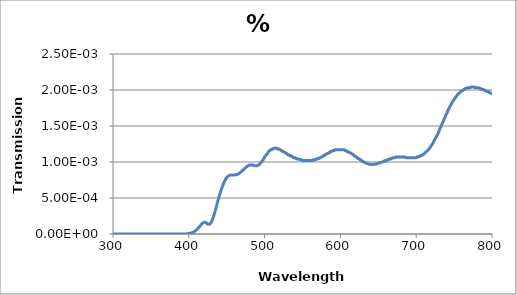
| Category | % Transmission |
|---|---|
| 200.0 | 0 |
| 201.0 | 0 |
| 202.0 | 0 |
| 203.0 | 0 |
| 204.0 | 0 |
| 205.0 | 0 |
| 206.0 | 0 |
| 207.0 | 0 |
| 208.0 | 0 |
| 209.0 | 0 |
| 210.0 | 0 |
| 211.0 | 0 |
| 212.0 | 0 |
| 213.0 | 0 |
| 214.0 | 0 |
| 215.0 | 0 |
| 216.0 | 0 |
| 217.0 | 0 |
| 218.0 | 0 |
| 219.0 | 0 |
| 220.0 | 0 |
| 221.0 | 0 |
| 222.0 | 0 |
| 223.0 | 0 |
| 224.0 | 0 |
| 225.0 | 0 |
| 226.0 | 0 |
| 227.0 | 0 |
| 228.0 | 0 |
| 229.0 | 0 |
| 230.0 | 0 |
| 231.0 | 0 |
| 232.0 | 0 |
| 233.0 | 0 |
| 234.0 | 0 |
| 235.0 | 0 |
| 236.0 | 0 |
| 237.0 | 0 |
| 238.0 | 0 |
| 239.0 | 0 |
| 240.0 | 0 |
| 241.0 | 0 |
| 242.0 | 0 |
| 243.0 | 0 |
| 244.0 | 0 |
| 245.0 | 0 |
| 246.0 | 0 |
| 247.0 | 0 |
| 248.0 | 0 |
| 249.0 | 0 |
| 250.0 | 0 |
| 251.0 | 0 |
| 252.0 | 0 |
| 253.0 | 0 |
| 254.0 | 0 |
| 255.0 | 0 |
| 256.0 | 0 |
| 257.0 | 0 |
| 258.0 | 0 |
| 259.0 | 0 |
| 260.0 | 0 |
| 261.0 | 0 |
| 262.0 | 0 |
| 263.0 | 0 |
| 264.0 | 0 |
| 265.0 | 0 |
| 266.0 | 0 |
| 267.0 | 0 |
| 268.0 | 0 |
| 269.0 | 0 |
| 270.0 | 0 |
| 271.0 | 0 |
| 272.0 | 0 |
| 273.0 | 0 |
| 274.0 | 0 |
| 275.0 | 0 |
| 276.0 | 0 |
| 277.0 | 0 |
| 278.0 | 0 |
| 279.0 | 0 |
| 280.0 | 0 |
| 281.0 | 0 |
| 282.0 | 0 |
| 283.0 | 0 |
| 284.0 | 0 |
| 285.0 | 0 |
| 286.0 | 0 |
| 287.0 | 0 |
| 288.0 | 0 |
| 289.0 | 0 |
| 290.0 | 0 |
| 291.0 | 0 |
| 292.0 | 0 |
| 293.0 | 0 |
| 294.0 | 0 |
| 295.0 | 0 |
| 296.0 | 0 |
| 297.0 | 0 |
| 298.0 | 0 |
| 299.0 | 0 |
| 300.0 | 0 |
| 301.0 | 0 |
| 302.0 | 0 |
| 303.0 | 0 |
| 304.0 | 0 |
| 305.0 | 0 |
| 306.0 | 0 |
| 307.0 | 0 |
| 308.0 | 0 |
| 309.0 | 0 |
| 310.0 | 0 |
| 311.0 | 0 |
| 312.0 | 0 |
| 313.0 | 0 |
| 314.0 | 0 |
| 315.0 | 0 |
| 316.0 | 0 |
| 317.0 | 0 |
| 318.0 | 0 |
| 319.0 | 0 |
| 320.0 | 0 |
| 321.0 | 0 |
| 322.0 | 0 |
| 323.0 | 0 |
| 324.0 | 0 |
| 325.0 | 0 |
| 326.0 | 0 |
| 327.0 | 0 |
| 328.0 | 0 |
| 329.0 | 0 |
| 330.0 | 0 |
| 331.0 | 0 |
| 332.0 | 0 |
| 333.0 | 0 |
| 334.0 | 0 |
| 335.0 | 0 |
| 336.0 | 0 |
| 337.0 | 0 |
| 338.0 | 0 |
| 339.0 | 0 |
| 340.0 | 0 |
| 341.0 | 0 |
| 342.0 | 0 |
| 343.0 | 0 |
| 344.0 | 0 |
| 345.0 | 0 |
| 346.0 | 0 |
| 347.0 | 0 |
| 348.0 | 0 |
| 349.0 | 0 |
| 350.0 | 0 |
| 351.0 | 0 |
| 352.0 | 0 |
| 353.0 | 0 |
| 354.0 | 0 |
| 355.0 | 0 |
| 356.0 | 0 |
| 357.0 | 0 |
| 358.0 | 0 |
| 359.0 | 0 |
| 360.0 | 0 |
| 361.0 | 0 |
| 362.0 | 0 |
| 363.0 | 0 |
| 364.0 | 0 |
| 365.0 | 0 |
| 366.0 | 0 |
| 367.0 | 0 |
| 368.0 | 0 |
| 369.0 | 0 |
| 370.0 | 0 |
| 371.0 | 0 |
| 372.0 | 0 |
| 373.0 | 0 |
| 374.0 | 0 |
| 375.0 | 0 |
| 376.0 | 0 |
| 377.0 | 0 |
| 378.0 | 0 |
| 379.0 | 0 |
| 380.0 | 0 |
| 381.0 | 0 |
| 382.0 | 0 |
| 383.0 | 0 |
| 384.0 | 0 |
| 385.0 | 0 |
| 386.0 | 0 |
| 387.0 | 0 |
| 388.0 | 0 |
| 389.0 | 0 |
| 390.0 | 0 |
| 391.0 | 0 |
| 392.0 | 0 |
| 393.0 | 0 |
| 394.0 | 0 |
| 395.0 | 0 |
| 396.0 | 0 |
| 397.0 | 0 |
| 398.0 | 0 |
| 399.0 | 0 |
| 400.0 | 0 |
| 401.0 | 0 |
| 402.0 | 0 |
| 403.0 | 0 |
| 404.0 | 0 |
| 405.0 | 0 |
| 406.0 | 0 |
| 407.0 | 0 |
| 408.0 | 0 |
| 409.0 | 0 |
| 410.0 | 0 |
| 411.0 | 0 |
| 412.0 | 0 |
| 413.0 | 0 |
| 414.0 | 0 |
| 415.0 | 0 |
| 416.0 | 0 |
| 417.0 | 0 |
| 418.0 | 0 |
| 419.0 | 0 |
| 420.0 | 0 |
| 421.0 | 0 |
| 422.0 | 0 |
| 423.0 | 0 |
| 424.0 | 0 |
| 425.0 | 0 |
| 426.0 | 0 |
| 427.0 | 0 |
| 428.0 | 0 |
| 429.0 | 0 |
| 430.0 | 0 |
| 431.0 | 0 |
| 432.0 | 0 |
| 433.0 | 0 |
| 434.0 | 0 |
| 435.0 | 0 |
| 436.0 | 0 |
| 437.0 | 0 |
| 438.0 | 0 |
| 439.0 | 0 |
| 440.0 | 0.001 |
| 441.0 | 0.001 |
| 442.0 | 0.001 |
| 443.0 | 0.001 |
| 444.0 | 0.001 |
| 445.0 | 0.001 |
| 446.0 | 0.001 |
| 447.0 | 0.001 |
| 448.0 | 0.001 |
| 449.0 | 0.001 |
| 450.0 | 0.001 |
| 451.0 | 0.001 |
| 452.0 | 0.001 |
| 453.0 | 0.001 |
| 454.0 | 0.001 |
| 455.0 | 0.001 |
| 456.0 | 0.001 |
| 457.0 | 0.001 |
| 458.0 | 0.001 |
| 459.0 | 0.001 |
| 460.0 | 0.001 |
| 461.0 | 0.001 |
| 462.0 | 0.001 |
| 463.0 | 0.001 |
| 464.0 | 0.001 |
| 465.0 | 0.001 |
| 466.0 | 0.001 |
| 467.0 | 0.001 |
| 468.0 | 0.001 |
| 469.0 | 0.001 |
| 470.0 | 0.001 |
| 471.0 | 0.001 |
| 472.0 | 0.001 |
| 473.0 | 0.001 |
| 474.0 | 0.001 |
| 475.0 | 0.001 |
| 476.0 | 0.001 |
| 477.0 | 0.001 |
| 478.0 | 0.001 |
| 479.0 | 0.001 |
| 480.0 | 0.001 |
| 481.0 | 0.001 |
| 482.0 | 0.001 |
| 483.0 | 0.001 |
| 484.0 | 0.001 |
| 485.0 | 0.001 |
| 486.0 | 0.001 |
| 487.0 | 0.001 |
| 488.0 | 0.001 |
| 489.0 | 0.001 |
| 490.0 | 0.001 |
| 491.0 | 0.001 |
| 492.0 | 0.001 |
| 493.0 | 0.001 |
| 494.0 | 0.001 |
| 495.0 | 0.001 |
| 496.0 | 0.001 |
| 497.0 | 0.001 |
| 498.0 | 0.001 |
| 499.0 | 0.001 |
| 500.0 | 0.001 |
| 501.0 | 0.001 |
| 502.0 | 0.001 |
| 503.0 | 0.001 |
| 504.0 | 0.001 |
| 505.0 | 0.001 |
| 506.0 | 0.001 |
| 507.0 | 0.001 |
| 508.0 | 0.001 |
| 509.0 | 0.001 |
| 510.0 | 0.001 |
| 511.0 | 0.001 |
| 512.0 | 0.001 |
| 513.0 | 0.001 |
| 514.0 | 0.001 |
| 515.0 | 0.001 |
| 516.0 | 0.001 |
| 517.0 | 0.001 |
| 518.0 | 0.001 |
| 519.0 | 0.001 |
| 520.0 | 0.001 |
| 521.0 | 0.001 |
| 522.0 | 0.001 |
| 523.0 | 0.001 |
| 524.0 | 0.001 |
| 525.0 | 0.001 |
| 526.0 | 0.001 |
| 527.0 | 0.001 |
| 528.0 | 0.001 |
| 529.0 | 0.001 |
| 530.0 | 0.001 |
| 531.0 | 0.001 |
| 532.0 | 0.001 |
| 533.0 | 0.001 |
| 534.0 | 0.001 |
| 535.0 | 0.001 |
| 536.0 | 0.001 |
| 537.0 | 0.001 |
| 538.0 | 0.001 |
| 539.0 | 0.001 |
| 540.0 | 0.001 |
| 541.0 | 0.001 |
| 542.0 | 0.001 |
| 543.0 | 0.001 |
| 544.0 | 0.001 |
| 545.0 | 0.001 |
| 546.0 | 0.001 |
| 547.0 | 0.001 |
| 548.0 | 0.001 |
| 549.0 | 0.001 |
| 550.0 | 0.001 |
| 551.0 | 0.001 |
| 552.0 | 0.001 |
| 553.0 | 0.001 |
| 554.0 | 0.001 |
| 555.0 | 0.001 |
| 556.0 | 0.001 |
| 557.0 | 0.001 |
| 558.0 | 0.001 |
| 559.0 | 0.001 |
| 560.0 | 0.001 |
| 561.0 | 0.001 |
| 562.0 | 0.001 |
| 563.0 | 0.001 |
| 564.0 | 0.001 |
| 565.0 | 0.001 |
| 566.0 | 0.001 |
| 567.0 | 0.001 |
| 568.0 | 0.001 |
| 569.0 | 0.001 |
| 570.0 | 0.001 |
| 571.0 | 0.001 |
| 572.0 | 0.001 |
| 573.0 | 0.001 |
| 574.0 | 0.001 |
| 575.0 | 0.001 |
| 576.0 | 0.001 |
| 577.0 | 0.001 |
| 578.0 | 0.001 |
| 579.0 | 0.001 |
| 580.0 | 0.001 |
| 581.0 | 0.001 |
| 582.0 | 0.001 |
| 583.0 | 0.001 |
| 584.0 | 0.001 |
| 585.0 | 0.001 |
| 586.0 | 0.001 |
| 587.0 | 0.001 |
| 588.0 | 0.001 |
| 589.0 | 0.001 |
| 590.0 | 0.001 |
| 591.0 | 0.001 |
| 592.0 | 0.001 |
| 593.0 | 0.001 |
| 594.0 | 0.001 |
| 595.0 | 0.001 |
| 596.0 | 0.001 |
| 597.0 | 0.001 |
| 598.0 | 0.001 |
| 599.0 | 0.001 |
| 600.0 | 0.001 |
| 601.0 | 0.001 |
| 602.0 | 0.001 |
| 603.0 | 0.001 |
| 604.0 | 0.001 |
| 605.0 | 0.001 |
| 606.0 | 0.001 |
| 607.0 | 0.001 |
| 608.0 | 0.001 |
| 609.0 | 0.001 |
| 610.0 | 0.001 |
| 611.0 | 0.001 |
| 612.0 | 0.001 |
| 613.0 | 0.001 |
| 614.0 | 0.001 |
| 615.0 | 0.001 |
| 616.0 | 0.001 |
| 617.0 | 0.001 |
| 618.0 | 0.001 |
| 619.0 | 0.001 |
| 620.0 | 0.001 |
| 621.0 | 0.001 |
| 622.0 | 0.001 |
| 623.0 | 0.001 |
| 624.0 | 0.001 |
| 625.0 | 0.001 |
| 626.0 | 0.001 |
| 627.0 | 0.001 |
| 628.0 | 0.001 |
| 629.0 | 0.001 |
| 630.0 | 0.001 |
| 631.0 | 0.001 |
| 632.0 | 0.001 |
| 633.0 | 0.001 |
| 634.0 | 0.001 |
| 635.0 | 0.001 |
| 636.0 | 0.001 |
| 637.0 | 0.001 |
| 638.0 | 0.001 |
| 639.0 | 0.001 |
| 640.0 | 0.001 |
| 641.0 | 0.001 |
| 642.0 | 0.001 |
| 643.0 | 0.001 |
| 644.0 | 0.001 |
| 645.0 | 0.001 |
| 646.0 | 0.001 |
| 647.0 | 0.001 |
| 648.0 | 0.001 |
| 649.0 | 0.001 |
| 650.0 | 0.001 |
| 651.0 | 0.001 |
| 652.0 | 0.001 |
| 653.0 | 0.001 |
| 654.0 | 0.001 |
| 655.0 | 0.001 |
| 656.0 | 0.001 |
| 657.0 | 0.001 |
| 658.0 | 0.001 |
| 659.0 | 0.001 |
| 660.0 | 0.001 |
| 661.0 | 0.001 |
| 662.0 | 0.001 |
| 663.0 | 0.001 |
| 664.0 | 0.001 |
| 665.0 | 0.001 |
| 666.0 | 0.001 |
| 667.0 | 0.001 |
| 668.0 | 0.001 |
| 669.0 | 0.001 |
| 670.0 | 0.001 |
| 671.0 | 0.001 |
| 672.0 | 0.001 |
| 673.0 | 0.001 |
| 674.0 | 0.001 |
| 675.0 | 0.001 |
| 676.0 | 0.001 |
| 677.0 | 0.001 |
| 678.0 | 0.001 |
| 679.0 | 0.001 |
| 680.0 | 0.001 |
| 681.0 | 0.001 |
| 682.0 | 0.001 |
| 683.0 | 0.001 |
| 684.0 | 0.001 |
| 685.0 | 0.001 |
| 686.0 | 0.001 |
| 687.0 | 0.001 |
| 688.0 | 0.001 |
| 689.0 | 0.001 |
| 690.0 | 0.001 |
| 691.0 | 0.001 |
| 692.0 | 0.001 |
| 693.0 | 0.001 |
| 694.0 | 0.001 |
| 695.0 | 0.001 |
| 696.0 | 0.001 |
| 697.0 | 0.001 |
| 698.0 | 0.001 |
| 699.0 | 0.001 |
| 700.0 | 0.001 |
| 701.0 | 0.001 |
| 702.0 | 0.001 |
| 703.0 | 0.001 |
| 704.0 | 0.001 |
| 705.0 | 0.001 |
| 706.0 | 0.001 |
| 707.0 | 0.001 |
| 708.0 | 0.001 |
| 709.0 | 0.001 |
| 710.0 | 0.001 |
| 711.0 | 0.001 |
| 712.0 | 0.001 |
| 713.0 | 0.001 |
| 714.0 | 0.001 |
| 715.0 | 0.001 |
| 716.0 | 0.001 |
| 717.0 | 0.001 |
| 718.0 | 0.001 |
| 719.0 | 0.001 |
| 720.0 | 0.001 |
| 721.0 | 0.001 |
| 722.0 | 0.001 |
| 723.0 | 0.001 |
| 724.0 | 0.001 |
| 725.0 | 0.001 |
| 726.0 | 0.001 |
| 727.0 | 0.001 |
| 728.0 | 0.001 |
| 729.0 | 0.001 |
| 730.0 | 0.001 |
| 731.0 | 0.001 |
| 732.0 | 0.001 |
| 733.0 | 0.002 |
| 734.0 | 0.002 |
| 735.0 | 0.002 |
| 736.0 | 0.002 |
| 737.0 | 0.002 |
| 738.0 | 0.002 |
| 739.0 | 0.002 |
| 740.0 | 0.002 |
| 741.0 | 0.002 |
| 742.0 | 0.002 |
| 743.0 | 0.002 |
| 744.0 | 0.002 |
| 745.0 | 0.002 |
| 746.0 | 0.002 |
| 747.0 | 0.002 |
| 748.0 | 0.002 |
| 749.0 | 0.002 |
| 750.0 | 0.002 |
| 751.0 | 0.002 |
| 752.0 | 0.002 |
| 753.0 | 0.002 |
| 754.0 | 0.002 |
| 755.0 | 0.002 |
| 756.0 | 0.002 |
| 757.0 | 0.002 |
| 758.0 | 0.002 |
| 759.0 | 0.002 |
| 760.0 | 0.002 |
| 761.0 | 0.002 |
| 762.0 | 0.002 |
| 763.0 | 0.002 |
| 764.0 | 0.002 |
| 765.0 | 0.002 |
| 766.0 | 0.002 |
| 767.0 | 0.002 |
| 768.0 | 0.002 |
| 769.0 | 0.002 |
| 770.0 | 0.002 |
| 771.0 | 0.002 |
| 772.0 | 0.002 |
| 773.0 | 0.002 |
| 774.0 | 0.002 |
| 775.0 | 0.002 |
| 776.0 | 0.002 |
| 777.0 | 0.002 |
| 778.0 | 0.002 |
| 779.0 | 0.002 |
| 780.0 | 0.002 |
| 781.0 | 0.002 |
| 782.0 | 0.002 |
| 783.0 | 0.002 |
| 784.0 | 0.002 |
| 785.0 | 0.002 |
| 786.0 | 0.002 |
| 787.0 | 0.002 |
| 788.0 | 0.002 |
| 789.0 | 0.002 |
| 790.0 | 0.002 |
| 791.0 | 0.002 |
| 792.0 | 0.002 |
| 793.0 | 0.002 |
| 794.0 | 0.002 |
| 795.0 | 0.002 |
| 796.0 | 0.002 |
| 797.0 | 0.002 |
| 798.0 | 0.002 |
| 799.0 | 0.002 |
| 800.0 | 0.002 |
| 801.0 | 0.002 |
| 802.0 | 0.002 |
| 803.0 | 0.002 |
| 804.0 | 0.002 |
| 805.0 | 0.002 |
| 806.0 | 0.002 |
| 807.0 | 0.002 |
| 808.0 | 0.002 |
| 809.0 | 0.002 |
| 810.0 | 0.002 |
| 811.0 | 0.002 |
| 812.0 | 0.002 |
| 813.0 | 0.002 |
| 814.0 | 0.002 |
| 815.0 | 0.002 |
| 816.0 | 0.002 |
| 817.0 | 0.002 |
| 818.0 | 0.002 |
| 819.0 | 0.002 |
| 820.0 | 0.002 |
| 821.0 | 0.002 |
| 822.0 | 0.002 |
| 823.0 | 0.002 |
| 824.0 | 0.002 |
| 825.0 | 0.002 |
| 826.0 | 0.002 |
| 827.0 | 0.002 |
| 828.0 | 0.002 |
| 829.0 | 0.002 |
| 830.0 | 0.002 |
| 831.0 | 0.002 |
| 832.0 | 0.002 |
| 833.0 | 0.002 |
| 834.0 | 0.002 |
| 835.0 | 0.002 |
| 836.0 | 0.002 |
| 837.0 | 0.002 |
| 838.0 | 0.002 |
| 839.0 | 0.002 |
| 840.0 | 0.002 |
| 841.0 | 0.002 |
| 842.0 | 0.002 |
| 843.0 | 0.002 |
| 844.0 | 0.002 |
| 845.0 | 0.002 |
| 846.0 | 0.002 |
| 847.0 | 0.002 |
| 848.0 | 0.002 |
| 849.0 | 0.002 |
| 850.0 | 0.002 |